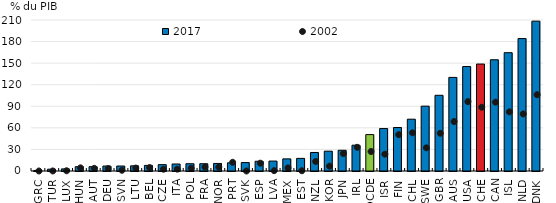
| Category | 2017 |
|---|---|
| GRC | 0.753 |
| TUR | 2.562 |
| LUX | 2.923 |
| HUN | 5.945 |
| AUT | 6.038 |
| DEU | 6.888 |
| SVN | 6.919 |
| LTU | 7.196 |
| BEL | 7.796 |
| CZE | 8.828 |
| ITA | 9.754 |
| POL | 10.124 |
| FRA | 10.125 |
| NOR | 10.478 |
| PRT | 11.414 |
| SVK | 11.739 |
| ESP | 13.569 |
| LVA | 13.811 |
| MEX | 16.875 |
| EST | 17.54 |
| NZL | 25.769 |
| KOR | 27.568 |
| JPN | 28.826 |
| IRL | 35.883 |
| OCDE | 50.622 |
| ISR | 59.031 |
| FIN | 60.487 |
| CHL | 72.04 |
| SWE | 90.2 |
| GBR | 105.299 |
| AUS | 130.173 |
| USA | 145.271 |
| CHE | 148.762 |
| CAN | 154.703 |
| ISL | 164.548 |
| NLD | 184.152 |
| DNK | 208.406 |